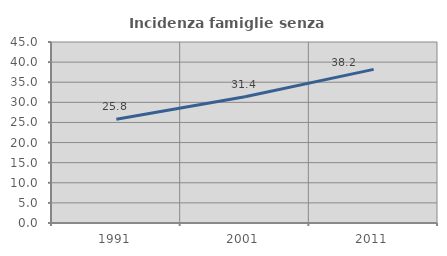
| Category | Incidenza famiglie senza nuclei |
|---|---|
| 1991.0 | 25.798 |
| 2001.0 | 31.406 |
| 2011.0 | 38.193 |